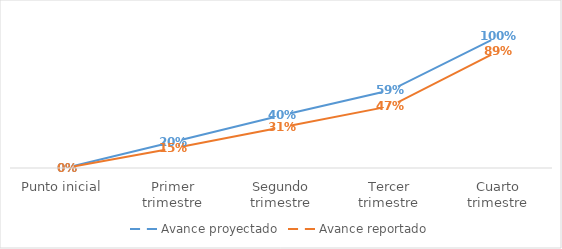
| Category | Avance proyectado | Avance reportado |
|---|---|---|
| Punto inicial | 0 | 0 |
| Primer trimestre | 0.2 | 0.15 |
| Segundo trimestre | 0.4 | 0.31 |
| Tercer trimestre | 0.59 | 0.47 |
| Cuarto trimestre | 1 | 0.89 |